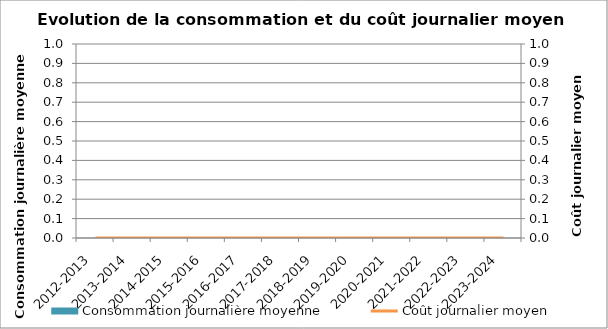
| Category | Consommation journalière moyenne |
|---|---|
| 2012-2013 | 0 |
| 2013-2014 | 0 |
| 2014-2015 | 0 |
| 2015-2016 | 0 |
| 2016-2017 | 0 |
| 2017-2018 | 0 |
| 2018-2019 | 0 |
| 2019-2020 | 0 |
| 2020-2021 | 0 |
| 2021-2022 | 0 |
| 2022-2023 | 0 |
| 2023-2024 | 0 |